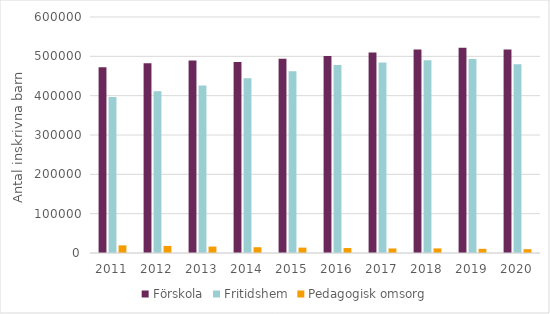
| Category | Förskola | Fritidshem | Pedagogisk omsorg |
|---|---|---|---|
| 2011.0 | 472161 | 396598 | 19397 |
| 2012.0 | 482309 | 411255 | 18064 |
| 2013.0 | 489275 | 425945 | 16348 |
| 2014.0 | 485721 | 444395 | 14681 |
| 2015.0 | 493609 | 461871 | 13654 |
| 2016.0 | 501013 | 478021 | 12551 |
| 2017.0 | 509784 | 484399 | 11585 |
| 2018.0 | 517670 | 489871 | 11680 |
| 2019.0 | 521885 | 493137 | 10615 |
| 2020.0 | 517405 | 480007 | 9723 |